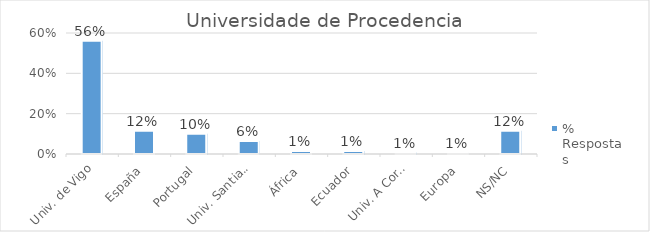
| Category | % Respostas |
|---|---|
| Univ. de Vigo | 0.561 |
| España | 0.115 |
| Portugal | 0.101 |
| Univ. Santiago | 0.065 |
| África | 0.014 |
| Ecuador | 0.014 |
| Univ. A Coruña | 0.007 |
| Europa | 0.007 |
| NS/NC | 0.115 |